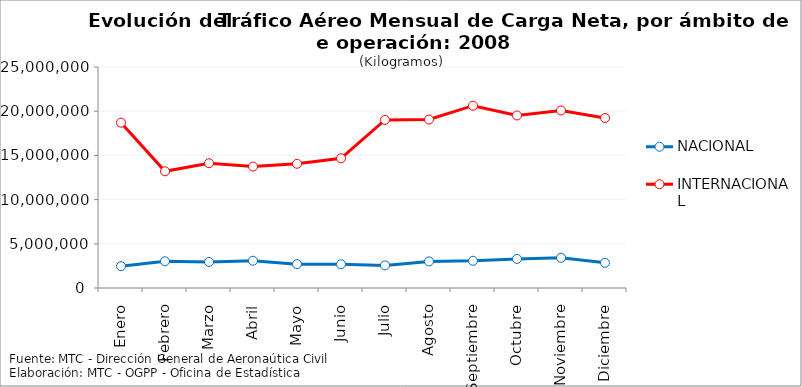
| Category | NACIONAL | INTERNACIONAL |
|---|---|---|
| Enero | 2464712 | 18702187 |
| Febrero | 3020058 | 13199483 |
| Marzo | 2947816 | 14116324 |
| Abril | 3084595 | 13737382 |
| Mayo | 2696341 | 14051816 |
| Junio | 2683705 | 14669729 |
| Julio | 2554819 | 19017381 |
| Agosto | 3007560 | 19057392 |
| Septiembre | 3080423 | 20623720 |
| Octubre | 3292766 | 19519116 |
| Noviembre | 3421609 | 20082563 |
| Diciembre | 2856185 | 19230343 |